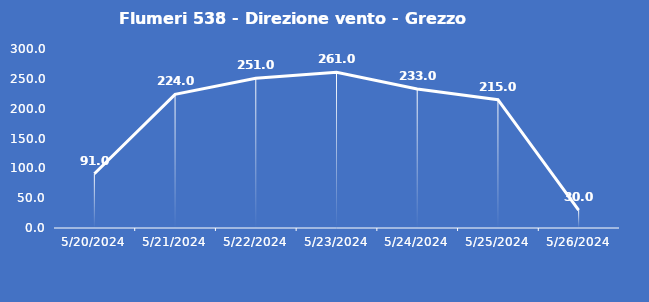
| Category | Flumeri 538 - Direzione vento - Grezzo (°N) |
|---|---|
| 5/20/24 | 91 |
| 5/21/24 | 224 |
| 5/22/24 | 251 |
| 5/23/24 | 261 |
| 5/24/24 | 233 |
| 5/25/24 | 215 |
| 5/26/24 | 30 |